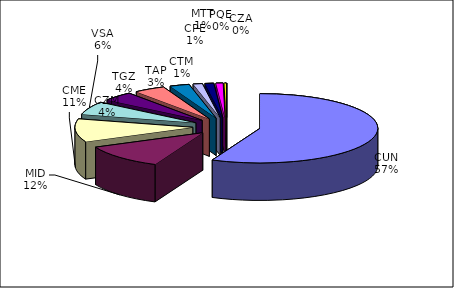
| Category | Series 0 |
|---|---|
| CUN | 114303 |
| MID | 23302 |
| CME | 21660 |
| VSA | 12343 |
| CZM | 8697 |
| TGZ | 8618 |
| TAP | 5407 |
| CTM | 2567 |
| CPE | 2402 |
| MTT | 1963 |
| PQE | 527 |
| CZA | 0 |